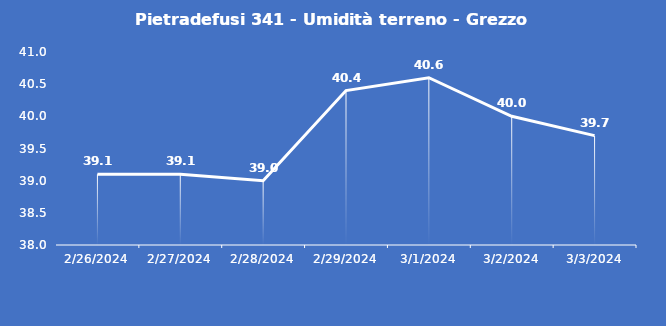
| Category | Pietradefusi 341 - Umidità terreno - Grezzo (%VWC) |
|---|---|
| 2/26/24 | 39.1 |
| 2/27/24 | 39.1 |
| 2/28/24 | 39 |
| 2/29/24 | 40.4 |
| 3/1/24 | 40.6 |
| 3/2/24 | 40 |
| 3/3/24 | 39.7 |